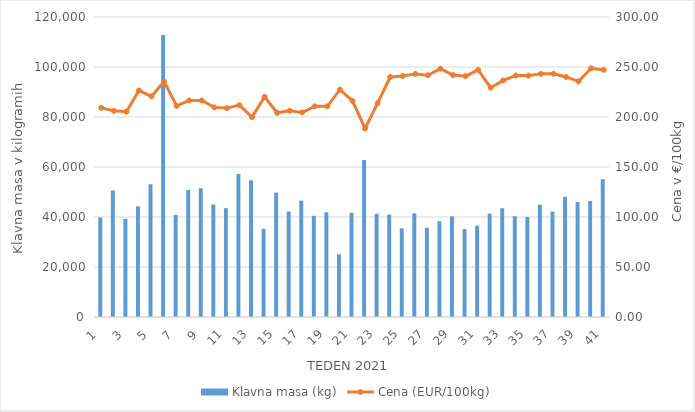
| Category | Klavna masa (kg) |
|---|---|
| 1.0 | 39814 |
| 2.0 | 50603 |
| 3.0 | 39295 |
| 4.0 | 44250 |
| 5.0 | 53061 |
| 6.0 | 112816 |
| 7.0 | 40829 |
| 8.0 | 50775 |
| 9.0 | 51535 |
| 10.0 | 45040 |
| 11.0 | 43536 |
| 12.0 | 57246 |
| 13.0 | 54680 |
| 14.0 | 35237 |
| 15.0 | 49721 |
| 16.0 | 42177 |
| 17.0 | 46525 |
| 18.0 | 40491 |
| 19.0 | 41888 |
| 20.0 | 25048 |
| 21.0 | 41651 |
| 22.0 | 62774 |
| 23.0 | 41297 |
| 24.0 | 40971 |
| 25.0 | 35465 |
| 26.0 | 41489 |
| 27.0 | 35675 |
| 28.0 | 38316 |
| 29.0 | 40265 |
| 30.0 | 35146 |
| 31.0 | 36548 |
| 32.0 | 41314 |
| 33.0 | 43471 |
| 34.0 | 40333 |
| 35.0 | 40041 |
| 36.0 | 44895 |
| 37.0 | 42158 |
| 38.0 | 48077 |
| 39.0 | 45950 |
| 40.0 | 46433 |
| 41.0 | 55121 |